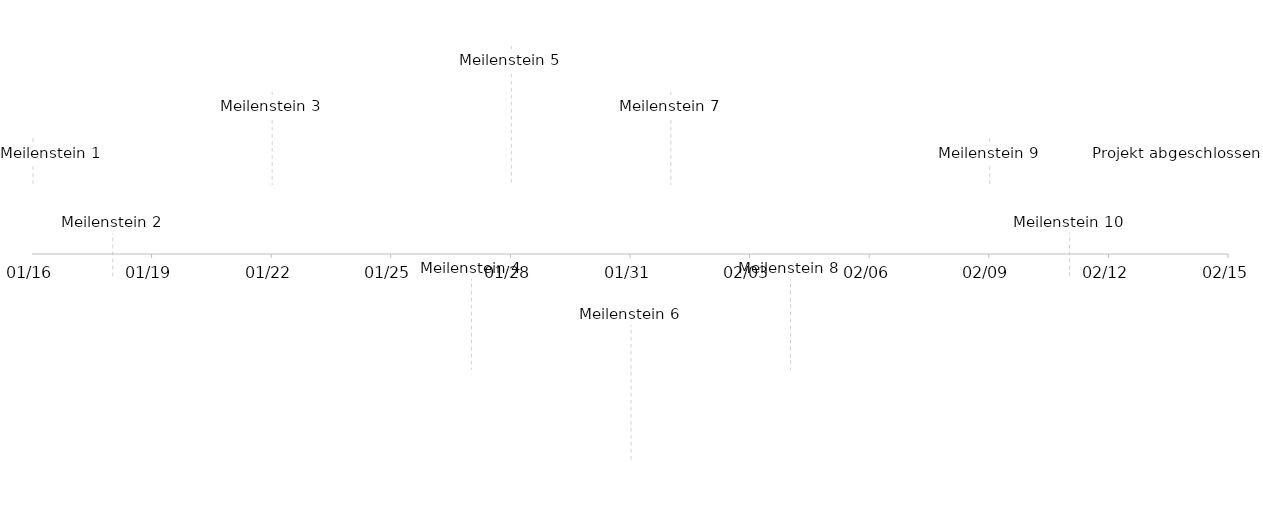
| Category | Series 1 |
|---|---|
| Meilenstein 1 | 5 |
| Meilenstein 2 | -5 |
| Meilenstein 3 | 10 |
| Meilenstein 4 | -10 |
| Meilenstein 5 | 15 |
| Meilenstein 6 | -15 |
| Meilenstein 7 | 10 |
| Meilenstein 8 | -10 |
| Meilenstein 9 | 5 |
| Meilenstein 10 | -5 |
| Projekt abgeschlossen | 5 |